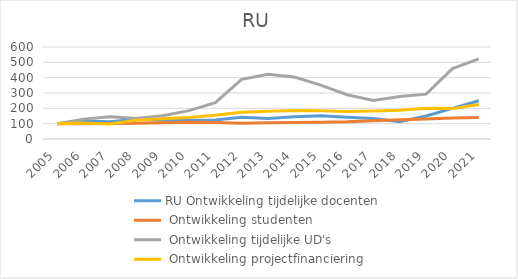
| Category | RU |
|---|---|
| 2005.0 | 100 |
| 2006.0 | 104.142 |
| 2007.0 | 97.362 |
| 2008.0 | 122.761 |
| 2009.0 | 132.223 |
| 2010.0 | 140.979 |
| 2011.0 | 154.957 |
| 2012.0 | 174.81 |
| 2013.0 | 181.234 |
| 2014.0 | 185.609 |
| 2015.0 | 183.644 |
| 2016.0 | 178.73 |
| 2017.0 | 181.967 |
| 2018.0 | 187.63 |
| 2019.0 | 200.741 |
| 2020.0 | 198.131 |
| 2021.0 | 224.926 |